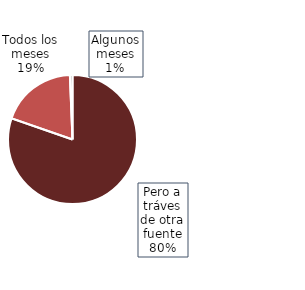
| Category | Series 0 |
|---|---|
| Pero a tráves de otra fuente | 0.803 |
| Todos los meses | 0.19 |
| Algunos meses | 0.007 |